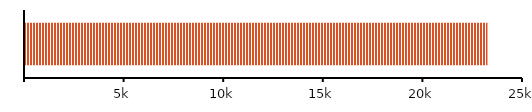
| Category | TOTAL ASSETS |
|---|---|
| 0 | 23216 |